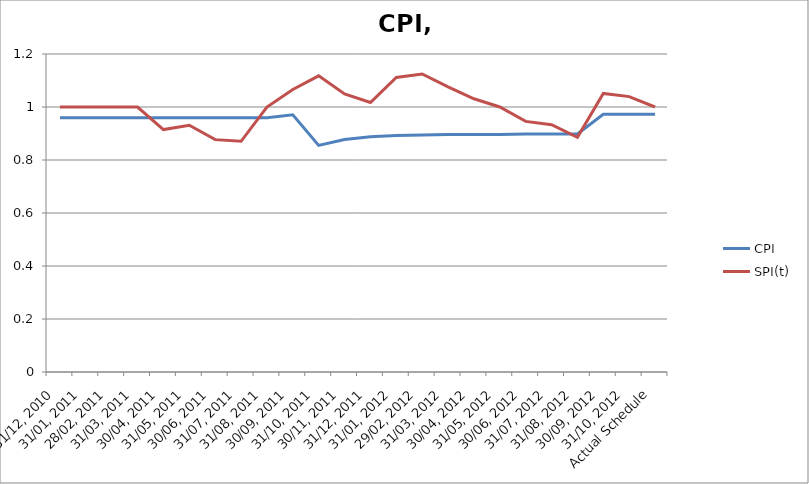
| Category | CPI | SPI(t) |
|---|---|---|
| 31/12, 2010 | 0.96 | 1 |
| 31/01, 2011 | 0.96 | 1 |
| 28/02, 2011 | 0.96 | 1 |
| 31/03, 2011 | 0.96 | 1 |
| 30/04, 2011 | 0.96 | 0.915 |
| 31/05, 2011 | 0.96 | 0.931 |
| 30/06, 2011 | 0.96 | 0.877 |
| 31/07, 2011 | 0.96 | 0.871 |
| 31/08, 2011 | 0.96 | 1 |
| 30/09, 2011 | 0.97 | 1.066 |
| 31/10, 2011 | 0.855 | 1.118 |
| 30/11, 2011 | 0.877 | 1.049 |
| 31/12, 2011 | 0.888 | 1.017 |
| 31/01, 2012 | 0.892 | 1.112 |
| 29/02, 2012 | 0.894 | 1.125 |
| 31/03, 2012 | 0.896 | 1.076 |
| 30/04, 2012 | 0.897 | 1.031 |
| 31/05, 2012 | 0.897 | 1 |
| 30/06, 2012 | 0.898 | 0.946 |
| 31/07, 2012 | 0.898 | 0.933 |
| 31/08, 2012 | 0.898 | 0.886 |
| 30/09, 2012 | 0.973 | 1.051 |
| 31/10, 2012 | 0.973 | 1.039 |
| Actual Schedule | 0.973 | 1 |